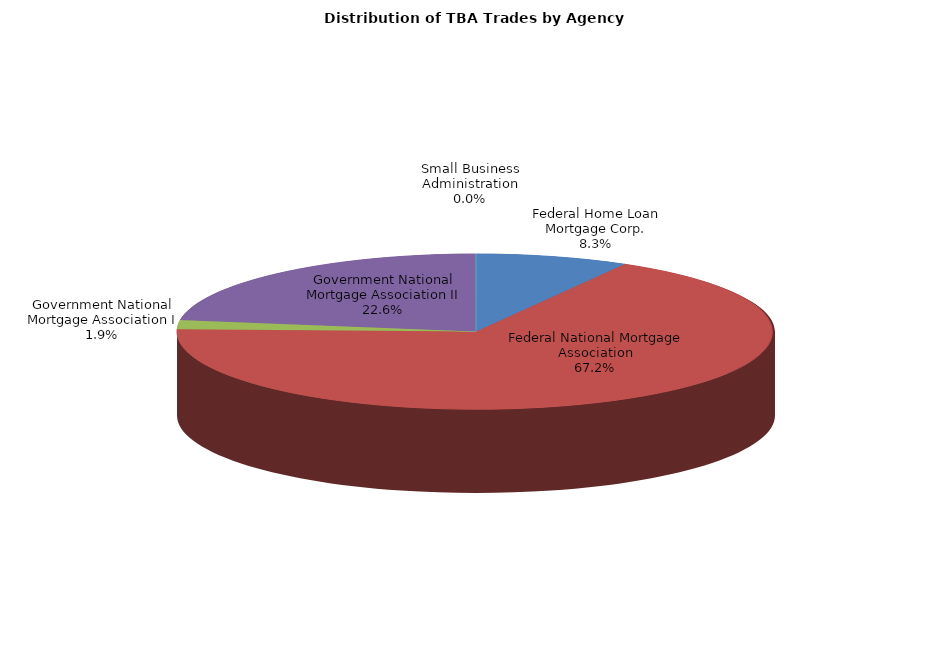
| Category | Series 0 |
|---|---|
| Federal Home Loan Mortgage Corp. | 604.532 |
| Federal National Mortgage Association | 4920.81 |
| Government National Mortgage Association I | 137.754 |
| Government National Mortgage Association II | 1653.81 |
| Small Business Administration | 1.167 |